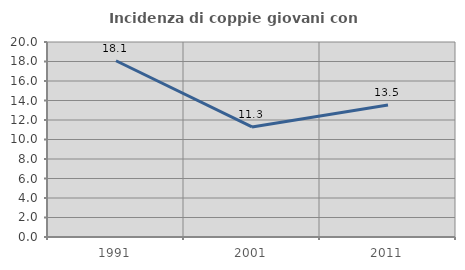
| Category | Incidenza di coppie giovani con figli |
|---|---|
| 1991.0 | 18.078 |
| 2001.0 | 11.287 |
| 2011.0 | 13.531 |